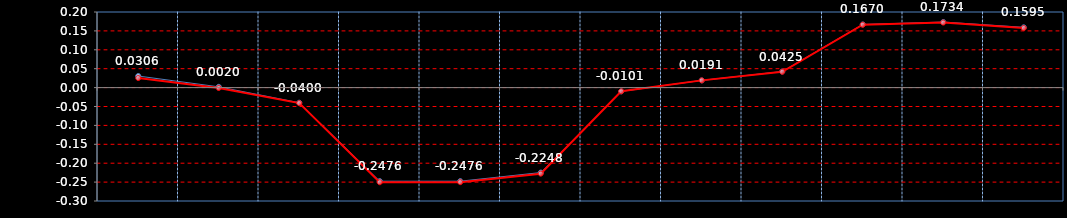
| Category | Last | Settlement |
|---|---|---|
|  | 0.031 | 0.025 |
|  | 0.002 | -0.001 |
|  | -0.04 | -0.041 |
|  | -0.248 | -0.25 |
|  | -0.248 | -0.25 |
|  | -0.225 | -0.228 |
|  | -0.01 | -0.01 |
|  | 0.019 | 0.019 |
|  | 0.042 | 0.042 |
|  | 0.167 | 0.166 |